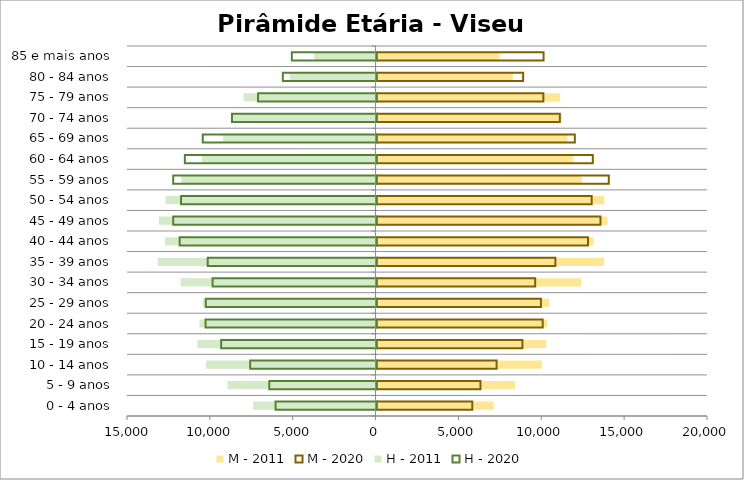
| Category | M - 2011 | M - 2020 | H - 2011 | H - 2020 |
|---|---|---|---|---|
| 0 - 4 anos | 7064 | 5776 | -7385 | -6095 |
| 5 - 9 anos | 8364 | 6270 | -8931 | -6474 |
| 10 - 14 anos | 9973 | 7244 | -10237 | -7627 |
| 15 - 19 anos | 10242 | 8801 | -10765 | -9380 |
| 20 - 24 anos | 10298 | 10024 | -10627 | -10318 |
| 25 - 29 anos | 10423 | 9918 | -10433 | -10304 |
| 30 - 34 anos | 12354 | 9571 | -11765 | -9897 |
| 35 - 39 anos | 13737 | 10790 | -13147 | -10188 |
| 40 - 44 anos | 13101 | 12760 | -12705 | -11882 |
| 45 - 49 anos | 13934 | 13512 | -13076 | -12272 |
| 50 - 54 anos | 13747 | 12980 | -12679 | -11799 |
| 55 - 59 anos | 12393 | 14013 | -11727 | -12273 |
| 60 - 64 anos | 11851 | 13049 | -10482 | -11569 |
| 65 - 69 anos | 11522 | 11963 | -9190 | -10488 |
| 70 - 74 anos | 11175 | 11059 | -8741 | -8723 |
| 75 - 79 anos | 11079 | 10065 | -7964 | -7152 |
| 80 - 84 anos | 8222 | 8844 | -5184 | -5656 |
| 85 e mais anos | 7422 | 10077 | -3701 | -5113 |